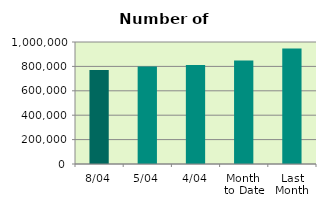
| Category | Series 0 |
|---|---|
| 8/04 | 770068 |
| 5/04 | 799156 |
| 4/04 | 811122 |
| Month 
to Date | 847427 |
| Last
Month | 947588.19 |